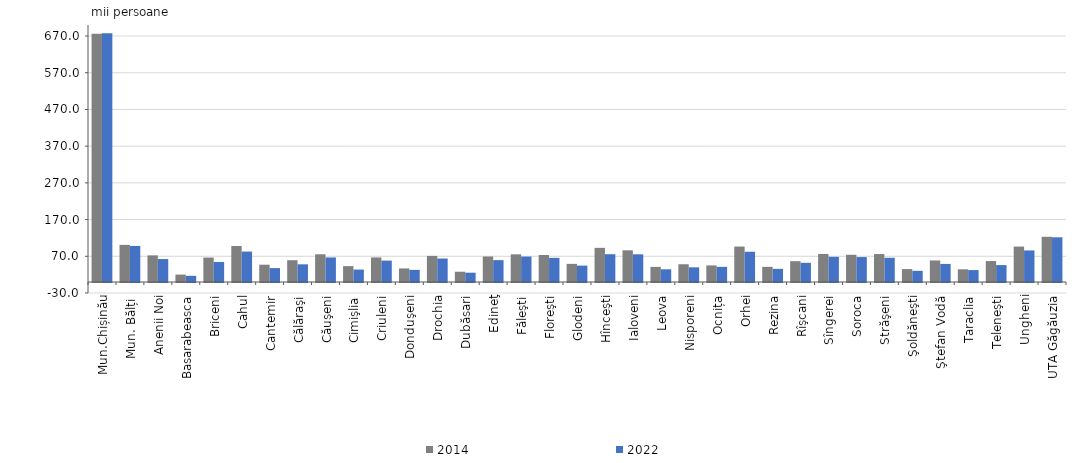
| Category | 2014 | 2022 |
|---|---|---|
| Mun.Chișinău | 675.967 | 677.456 |
| Mun. Bălți  | 101.073 | 98.155 |
| Anenii Noi | 72.472 | 62.422 |
| Basarabeasca | 20.167 | 16.78 |
| Briceni | 66.497 | 54.599 |
| Cahul | 97.959 | 82.847 |
| Cantemir | 47.083 | 37.822 |
| Călăraşi | 59.374 | 48.091 |
| Căuşeni | 75.431 | 66.792 |
| Cimişlia | 43.154 | 33.847 |
| Criuleni | 66.858 | 58.233 |
| Donduşeni | 36.894 | 32.983 |
| Drochia | 71.05 | 63.927 |
| Dubăsari | 27.955 | 25.296 |
|  Edineţ | 69.399 | 59.553 |
| Făleşti | 75.344 | 69.283 |
| Floreşti | 73.478 | 65.751 |
| Glodeni | 49.34 | 44.587 |
| Hînceşti | 92.982 | 75.693 |
| Ialoveni | 86.281 | 75.362 |
| Leova | 41.171 | 34.613 |
| Nisporeni | 48.302 | 39.902 |
| Ocnița | 45.106 | 41.214 |
| Orhei | 96.479 | 82.378 |
| Rezina | 41.238 | 35.713 |
| Rîşcani | 56.69 | 52.217 |
| Sîngerei | 76.362 | 68.552 |
| Soroca | 74.104 | 67.881 |
| Străşeni | 76.065 | 65.997 |
| Şoldăneşti | 35.157 | 30.447 |
| Ştefan Vodă | 58.639 | 49.204 |
| Taraclia | 34.588 | 32.471 |
| Teleneşti | 56.995 | 45.997 |
| Ungheni | 96.472 | 85.916 |
| UTA Găgăuzia | 123.107 | 121.747 |